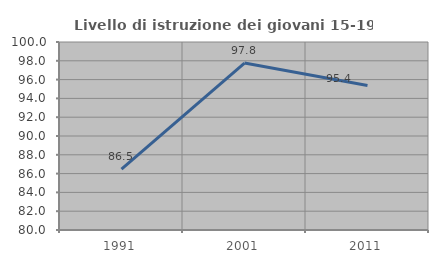
| Category | Livello di istruzione dei giovani 15-19 anni |
|---|---|
| 1991.0 | 86.486 |
| 2001.0 | 97.761 |
| 2011.0 | 95.37 |